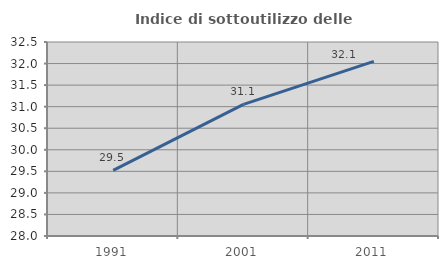
| Category | Indice di sottoutilizzo delle abitazioni  |
|---|---|
| 1991.0 | 29.524 |
| 2001.0 | 31.053 |
| 2011.0 | 32.051 |